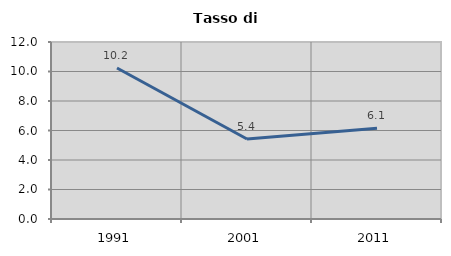
| Category | Tasso di disoccupazione   |
|---|---|
| 1991.0 | 10.236 |
| 2001.0 | 5.422 |
| 2011.0 | 6.145 |